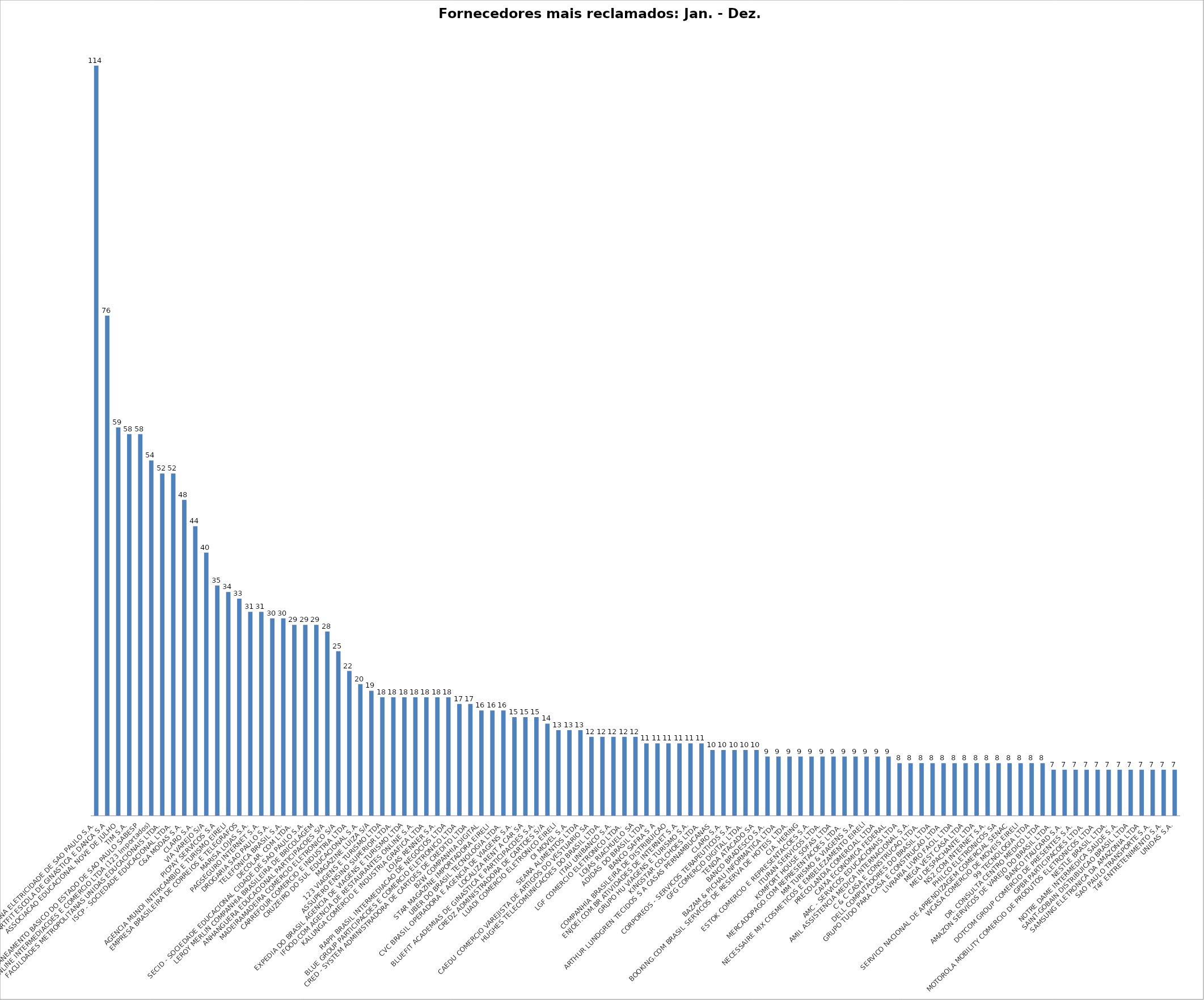
| Category | Series 0 |
|---|---|
| ELETROPAULO METROPOLITANA ELETRICIDADE DE SAO PAULO S.A. | 114 |
| SMARTFIT ESCOLA DE GINASTICA E DANCA S.A | 76 |
| ASSOCIACAO EDUCACIONAL NOVE DE JULHO | 59 |
| TIM S.A. | 58 |
| CIA DE SANEAMENTO BASICO DO ESTADO DE SAO PAULO SABESP | 58 |
| ONLINE INTERMEDIACOES E COMERCIO LTDA (123 Importados) | 54 |
| FACULDADES METROPOLITANAS UNIDAS EDUCACIONAIS LTDA. | 52 |
| ISCP - SOCIEDADE EDUCACIONAL LTDA. | 52 |
| C&A MODAS S.A. | 48 |
| CLARO S.A. | 44 |
| VIA VAREJO S/A | 40 |
| PICPAY SERVICOS S.A | 35 |
| AGENCIA MUNDI INTERCAMBIO E TURISMO EIRELI | 34 |
| EMPRESA BRASILEIRA DE CORREIOS E TELEGRAFOS | 33 |
| MARISA LOJAS S.A. | 31 |
| PAGSEGURO INTERNET S.A. | 31 |
| DROGARIA SAO PAULO S.A. | 30 |
| TELEFONICA BRASIL S.A. | 30 |
| DECOLAR. COM LTDA. | 29 |
| SECID - SOCIEDADE EDUCACIONAL CIDADE DE SAO PAULO S.A. | 29 |
| LEROY MERLIN COMPANHIA BRASILEIRA DE BRICOLAGEM | 29 |
| ANHANGUERA EDUCACIONAL PARTICIPACOES S/A | 28 |
| MADEIRAMADEIRA COMERCIO ELETRONICO S/A | 25 |
| CARREFOUR COMERCIO E INDUSTRIA LTDA | 22 |
| CRUZEIRO DO SUL EDUCACIONAL S.A. | 20 |
| MAGAZINE LUIZA S/A | 19 |
| 123 VIAGENS E TURISMO LTDA | 18 |
| ASSUPERO ENSINO SUPERIOR LTDA. | 18 |
| EXPEDIA DO BRASIL AGENCIA DE VIAGENS E TURISMO LTDA | 18 |
| IFOOD.COM AGENCIA DE RESTAURANTES ONLINE S.A. | 18 |
| KALUNGA COMERCIO E INDUSTRIA GRAFICA LTDA | 18 |
| LOJAS RENNER S.A. | 18 |
| RAPPI BRASIL INTERMEDIACAO DE NEGOCIOS LTDA | 18 |
| BLUE GROUP PARTICIPACOES E COMERCIO ELETRONICO LTDA | 17 |
| CRED - SYSTEM ADMINISTRADORA DE CARTOES DE CREDITO LTDA | 17 |
| B2W COMPANHIA DIGITAL | 16 |
| STAR MAGAZINE IMPORTADORA EIRELI | 16 |
| UBER DO BRASIL TECNOLOGIA LTDA. | 16 |
| CVC BRASIL OPERADORA E AGENCIA DE VIAGENS S.A. | 15 |
| LOCALIZA RENT A CAR SA | 15 |
| BLUEFIT ACADEMIAS DE GINASTICA E PARTICIPACOES S.A. | 15 |
| CREDZ ADMINISTRADORA DE CARTOES S/A | 14 |
| LUADI COMERCIO ELETRONICO EIRELI | 13 |
| OI MOVEL S.A. | 13 |
| SEARA ALIMENTOS LTDA | 13 |
| CAEDU COMERCIO VAREJISTA DE ARTIGOS DO VESTUARIO SA | 12 |
| HUGHES TELECOMUNICACOES DO BRASIL LTDA. | 12 |
| ITAU UNIBANCO S.A. | 12 |
| LGF COMERCIO ELETRONICO LTDA. | 12 |
| LOJAS RIACHUELO SA | 12 |
| ADIDAS DO BRASIL LTDA | 11 |
| BANCO SAFRA S A | 11 |
| COMPANHIA BRASILEIRA DE DISTRIBUICAO | 11 |
| ENJOEI.COM.BR ATIVIDADES DE INTERNET S.A. | 11 |
| GRUPO HU VIAGENS E TURISMO S.A. | 11 |
| KINGSTAR COLCHOES LTDA. | 11 |
| ARTHUR LUNDGREN TECIDOS S A CASAS PERNAMBUCANAS | 10 |
| CLARO S.A. | 10 |
| CORPOREOS - SERVICOS TERAPEUTICOS S.A. | 10 |
| GFG COMERCIO DIGITAL LTDA. | 10 |
| TENDA ATACADO SA | 10 |
| BANCO BRADESCO S.A. | 9 |
| BAZAM & PICHAU INFORMATICA LTDA | 9 |
| BOOKING.COM BRASIL SERVICOS DE RESERVA DE HOTEIS LTDA. | 9 |
| CIA. HERING | 9 |
| ESTOK COMERCIO E REPRESENTACOES S.A. | 9 |
| ITURAN SERVICOS LTDA. | 9 |
| KOMFORT HOUSE SOFAS LTDA | 9 |
| MERCADOPAGO.COM REPRESENTACOES LTDA. | 9 |
| MM TURISMO & VIAGENS S.A | 9 |
| NECESSAIRE MIX COSMETICOS E EMBELEZAMENTO EIRELI | 9 |
| PRECOLANDIA COMERCIAL LTDA | 9 |
| CAIXA ECONOMICA FEDERAL | 9 |
| AMC - SERVICOS EDUCACIONAIS LTDA | 8 |
| AMIL ASSISTENCIA MEDICA INTERNACIONAL S.A. | 8 |
| C & C CASA E CONSTRUCAO LTDA. | 8 |
| DELL COMPUTADORES DO BRASIL LTDA | 8 |
| GRUPO TUDO PARA CASA E CONSTRUCAO LTDA | 8 |
| LIVRARIA LIVRO FACIL LTDA | 8 |
| MEGA VEST CASA LTDA | 8 |
| MEU DESPACHANTE LTDA | 8 |
| NS2.COM INTERNET S.A. | 8 |
| PHILCO ELETRONICOS SA | 8 |
| SERVICO NACIONAL DE APRENDIZAGEM COMERCIAL SENAC | 8 |
| WCASA COMERCIO DE MOVEIS EIRELI | 8 |
| 99 TECNOLOGIA LTDA | 8 |
| DR. CONSULTA CENTRO MEDICO LTDA | 8 |
| AMAZON SERVICOS DE VAREJO DO BRASIL LTDA. | 7 |
| BANCO ITAUCARD S.A. | 7 |
| DOTCOM GROUP COMERCIO DE PRESENTES S.A. | 7 |
| GPBR PARTICIPACOES LTDA. | 7 |
| MOTOROLA MOBILITY COMERCIO DE PRODUTOS ELETRONICOS LTDA | 7 |
| NESTLE BRASIL LTDA. | 7 |
| NOTRE DAME INTERMEDICA SAUDE S.A. | 7 |
| SAINT-GOBAIN DISTRIBUICAO BRASIL LTDA | 7 |
| SAMSUNG ELETRONICA DA AMAZONIA LTDA | 7 |
| SAO PAULO TRANSPORTE S.A. | 7 |
| T4F ENTRETENIMENTO S.A. | 7 |
| UNIDAS S.A. | 7 |